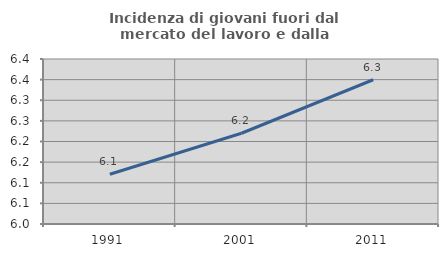
| Category | Incidenza di giovani fuori dal mercato del lavoro e dalla formazione  |
|---|---|
| 1991.0 | 6.121 |
| 2001.0 | 6.22 |
| 2011.0 | 6.35 |